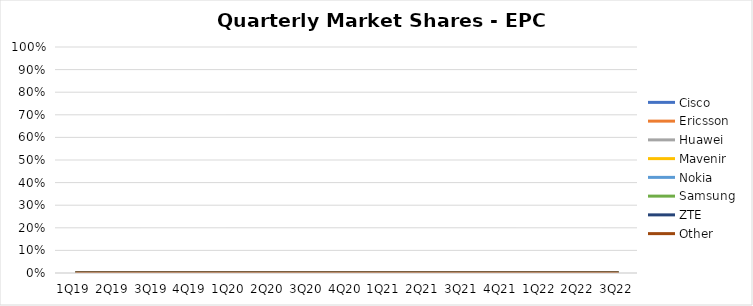
| Category | Cisco | Ericsson | Huawei | Mavenir | Nokia | Samsung | ZTE | Other |
|---|---|---|---|---|---|---|---|---|
| 1Q19 | 0 | 0 | 0 | 0 | 0 | 0 | 0 | 0 |
| 2Q19 | 0 | 0 | 0 | 0 | 0 | 0 | 0 | 0 |
| 3Q19 | 0 | 0 | 0 | 0 | 0 | 0 | 0 | 0 |
| 4Q19 | 0 | 0 | 0 | 0 | 0 | 0 | 0 | 0 |
| 1Q20 | 0 | 0 | 0 | 0 | 0 | 0 | 0 | 0 |
| 2Q20 | 0 | 0 | 0 | 0 | 0 | 0 | 0 | 0 |
| 3Q20 | 0 | 0 | 0 | 0 | 0 | 0 | 0 | 0 |
| 4Q20 | 0 | 0 | 0 | 0 | 0 | 0 | 0 | 0 |
| 1Q21 | 0 | 0 | 0 | 0 | 0 | 0 | 0 | 0 |
| 2Q21 | 0 | 0 | 0 | 0 | 0 | 0 | 0 | 0 |
| 3Q21 | 0 | 0 | 0 | 0 | 0 | 0 | 0 | 0 |
| 4Q21 | 0 | 0 | 0 | 0 | 0 | 0 | 0 | 0 |
| 1Q22 | 0 | 0 | 0 | 0 | 0 | 0 | 0 | 0 |
| 2Q22 | 0 | 0 | 0 | 0 | 0 | 0 | 0 | 0 |
| 3Q22 | 0 | 0 | 0 | 0 | 0 | 0 | 0 | 0 |